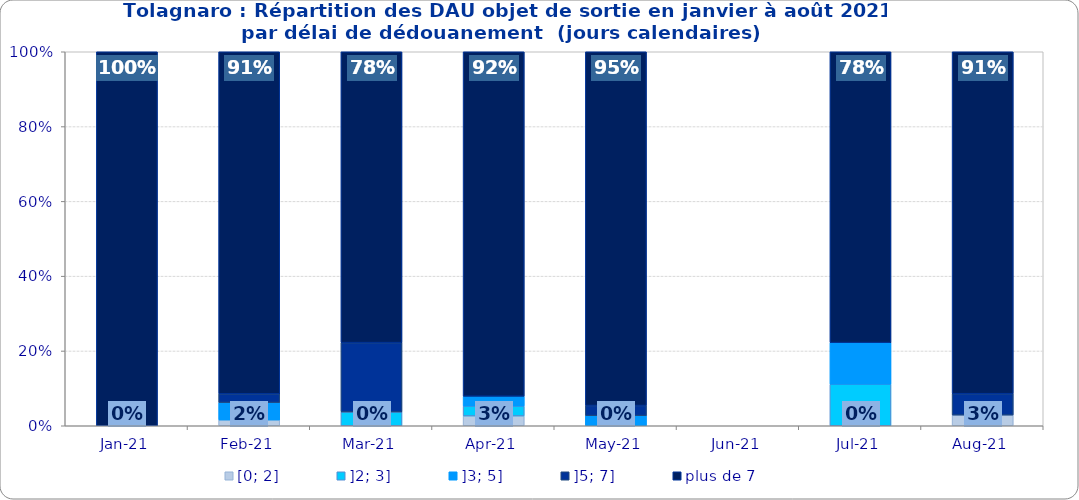
| Category | [0; 2] | ]2; 3] | ]3; 5] | ]5; 7] | plus de 7 |
|---|---|---|---|---|---|
| 2021-01-01 | 0 | 0 | 0 | 0 | 1 |
| 2021-02-01 | 0.016 | 0 | 0.047 | 0.023 | 0.915 |
| 2021-03-01 | 0 | 0.037 | 0 | 0.185 | 0.778 |
| 2021-04-01 | 0.026 | 0.026 | 0.026 | 0 | 0.921 |
| 2021-05-01 | 0 | 0 | 0.027 | 0.027 | 0.946 |
| 2021-06-01 | 0 | 0 | 0 | 0 | 0 |
| 2021-07-01 | 0 | 0.111 | 0.111 | 0 | 0.778 |
| 2021-08-01 | 0.029 | 0 | 0 | 0.057 | 0.914 |